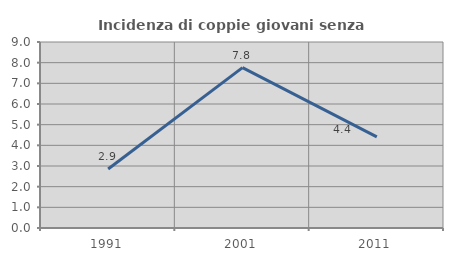
| Category | Incidenza di coppie giovani senza figli |
|---|---|
| 1991.0 | 2.857 |
| 2001.0 | 7.759 |
| 2011.0 | 4.412 |